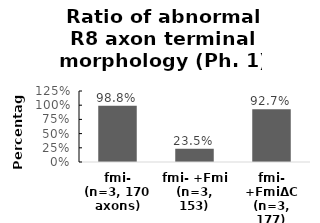
| Category | Series 0 |
|---|---|
| fmi-
(n=3, 170 axons) | 0.988 |
| fmi- +Fmi
(n=3, 153) | 0.235 |
| fmi- +FmiΔC
(n=3, 177) | 0.927 |